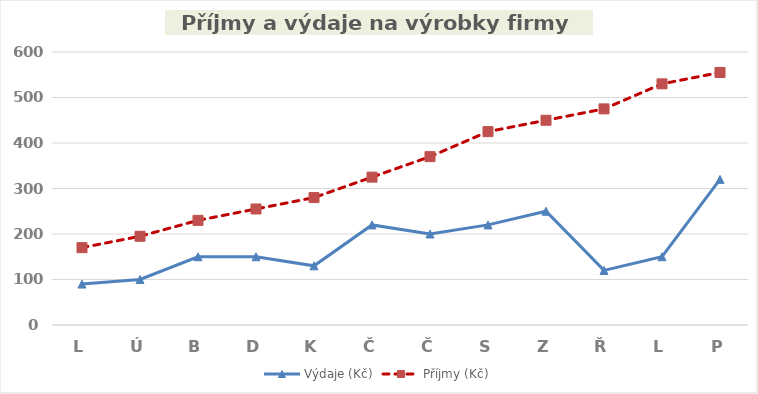
| Category | Výdaje (Kč) | Příjmy (Kč) |
|---|---|---|
| L | 90 | 170 |
| Ú | 100 | 195 |
| B | 150 | 230 |
| D | 150 | 255 |
| K | 130 | 280 |
| Č | 220 | 325 |
| Č | 200 | 370 |
| S | 220 | 425 |
| Z | 250 | 450 |
| Ř | 120 | 475 |
| L | 150 | 530 |
| P | 320 | 555 |